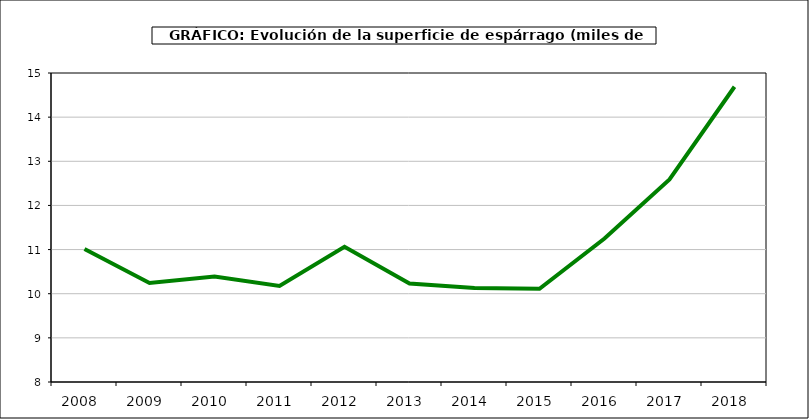
| Category | superficie |
|---|---|
| 2008.0 | 11.012 |
| 2009.0 | 10.243 |
| 2010.0 | 10.387 |
| 2011.0 | 10.178 |
| 2012.0 | 11.065 |
| 2013.0 | 10.231 |
| 2014.0 | 10.132 |
| 2015.0 | 10.112 |
| 2016.0 | 11.251 |
| 2017.0 | 12.589 |
| 2018.0 | 14.688 |